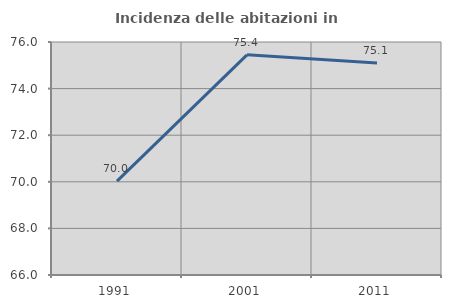
| Category | Incidenza delle abitazioni in proprietà  |
|---|---|
| 1991.0 | 70.029 |
| 2001.0 | 75.448 |
| 2011.0 | 75.1 |